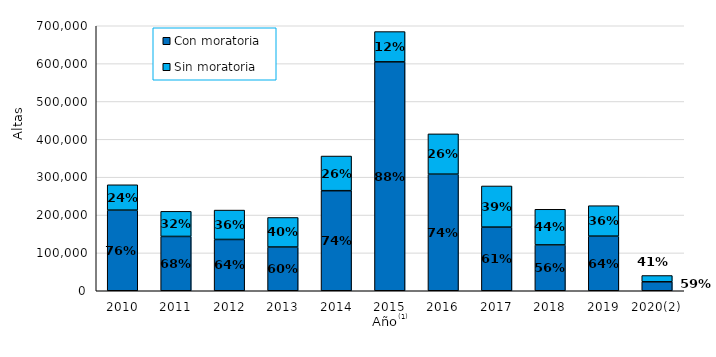
| Category | Con moratoria | Sin moratoria |
|---|---|---|
| 2010 | 212963 | 66977 |
| 2011 | 143437 | 66366 |
| 2012 | 135494 | 77630 |
| 2013 | 115505 | 78094 |
| 2014 | 264326 | 91569 |
| 2015 | 604618 | 80028 |
| 2016 | 307977 | 106446 |
| 2017 | 168076 | 108708 |
| 2018 | 121079 | 94129 |
| 2019 | 144232 | 80425 |
| 2020(2) | 23629 | 16623 |